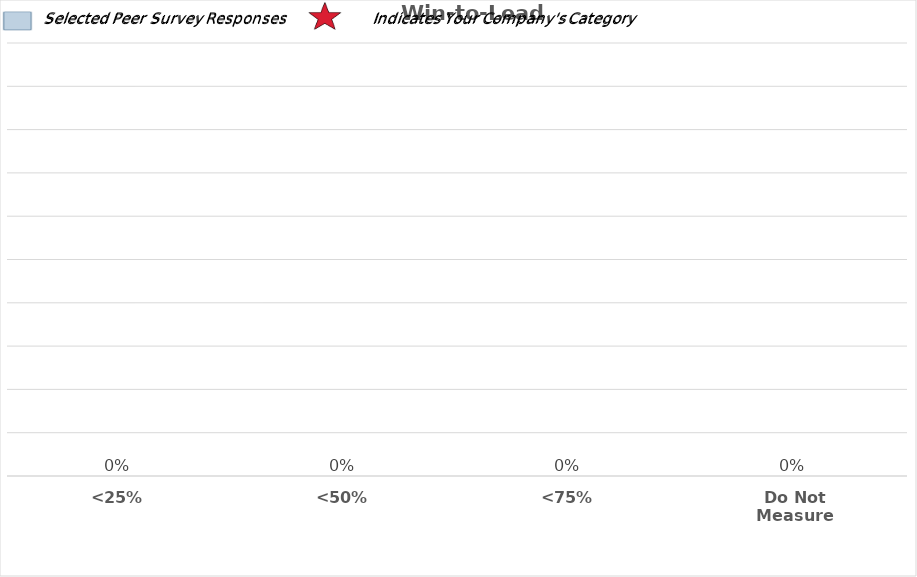
| Category | Series 0 |
|---|---|
| <25% | 0.833 |
| <50% | 0 |
| <75% | 0 |
| Do Not Measure | 0.167 |